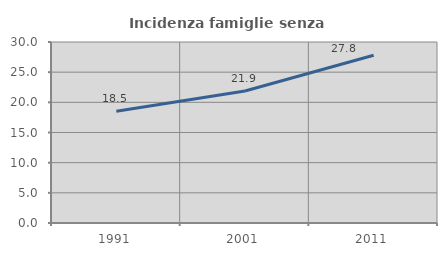
| Category | Incidenza famiglie senza nuclei |
|---|---|
| 1991.0 | 18.528 |
| 2001.0 | 21.881 |
| 2011.0 | 27.807 |